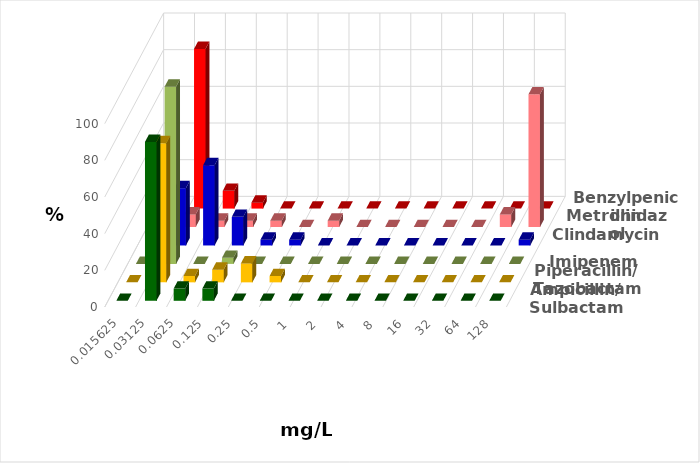
| Category | Ampicillin/ Sulbactam | Piperacillin/ Tazobactam | Imipenem | Clindamycin | Metronidazol | Benzylpenicillin |
|---|---|---|---|---|---|---|
| 0.015625 | 0 | 0 | 0 | 0 | 0 | 0 |
| 0.03125 | 86.667 | 75.862 | 96.667 | 31.25 | 6.897 | 87.097 |
| 0.0625 | 6.667 | 3.448 | 0 | 43.75 | 3.448 | 9.677 |
| 0.125 | 6.667 | 6.897 | 3.333 | 15.625 | 3.448 | 3.226 |
| 0.25 | 0 | 10.345 | 0 | 3.125 | 3.448 | 0 |
| 0.5 | 0 | 3.448 | 0 | 3.125 | 0 | 0 |
| 1.0 | 0 | 0 | 0 | 0 | 3.448 | 0 |
| 2.0 | 0 | 0 | 0 | 0 | 0 | 0 |
| 4.0 | 0 | 0 | 0 | 0 | 0 | 0 |
| 8.0 | 0 | 0 | 0 | 0 | 0 | 0 |
| 16.0 | 0 | 0 | 0 | 0 | 0 | 0 |
| 32.0 | 0 | 0 | 0 | 0 | 0 | 0 |
| 64.0 | 0 | 0 | 0 | 0 | 6.897 | 0 |
| 128.0 | 0 | 0 | 0 | 3.125 | 72.414 | 0 |